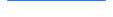
| Category | Series 0 |
|---|---|
| 0 | 18 |
| 1 | 18 |
| 2 | 19 |
| 3 | 15 |
| 4 | 16 |
| 5 | 8 |
| 6 | 8 |
| 7 | 14 |
| 8 | 8 |